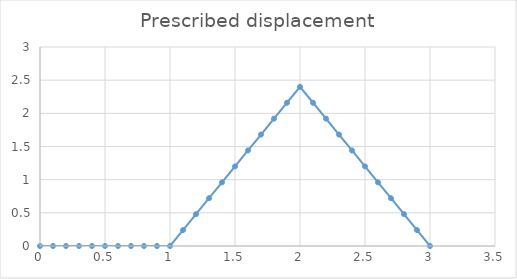
| Category | Prescribed displacement |
|---|---|
| 0.0 | 0 |
| 0.1 | 0 |
| 0.2 | 0 |
| 0.3 | 0 |
| 0.4 | 0 |
| 0.5 | 0 |
| 0.6 | 0 |
| 0.7 | 0 |
| 0.8 | 0 |
| 0.9 | 0 |
| 1.0 | 0 |
| 1.1 | 0.24 |
| 1.2 | 0.48 |
| 1.3 | 0.72 |
| 1.4 | 0.96 |
| 1.5 | 1.2 |
| 1.6 | 1.44 |
| 1.7 | 1.68 |
| 1.8 | 1.92 |
| 1.9 | 2.16 |
| 2.0 | 2.4 |
| 2.1 | 2.16 |
| 2.2 | 1.92 |
| 2.3 | 1.68 |
| 2.4 | 1.44 |
| 2.5 | 1.2 |
| 2.6 | 0.96 |
| 2.7 | 0.72 |
| 2.8 | 0.48 |
| 2.9 | 0.24 |
| 3.0 | 0 |